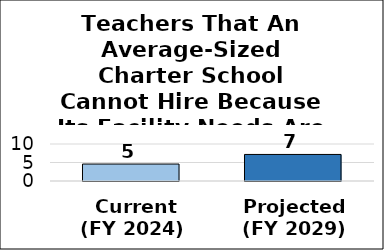
| Category | Teachers that an average-sized charter school cannot hire because its facility are not needs fully met |
|---|---|
|  Current
(FY 2024) | 4.584 |
| Projected
(FY 2029) | 7.175 |